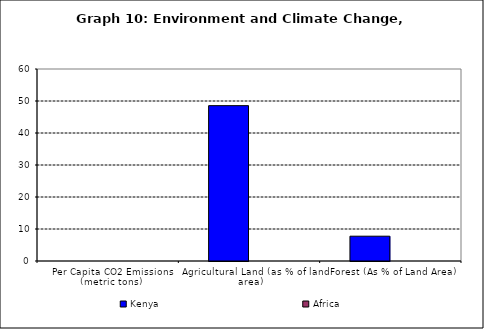
| Category | Kenya | Africa |
|---|---|---|
| Per Capita CO2 Emissions (metric tons) | 0 | 0 |
| Agricultural Land (as % of land area) | 48.547 | 0 |
| Forest (As % of Land Area) | 7.754 | 0 |